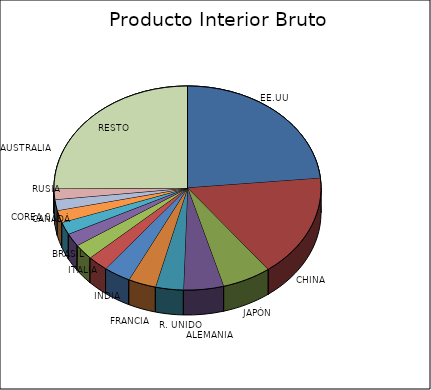
| Category | PIB nominal 2018 |
|---|---|
| EE.UU | 20413 |
| CHINA | 14093 |
| JAPÓN | 5167 |
| ALEMANIA | 4212 |
| R. UNIDO | 2936 |
| FRANCIA | 2925 |
| INDIA | 2848 |
| ITALIA | 2182 |
| BRASIL | 2139 |
| CANADÁ | 1799 |
| RUSIA | 1720 |
| COREA S. | 1693 |
| ESPAÑA | 1506 |
| AUSTRALIA | 1500 |
| RESTO | 21787 |